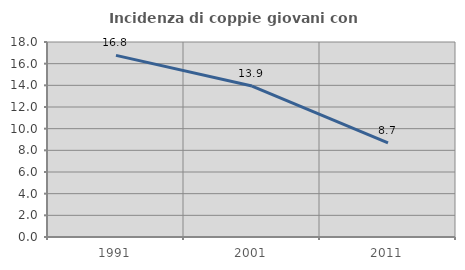
| Category | Incidenza di coppie giovani con figli |
|---|---|
| 1991.0 | 16.769 |
| 2001.0 | 13.932 |
| 2011.0 | 8.688 |